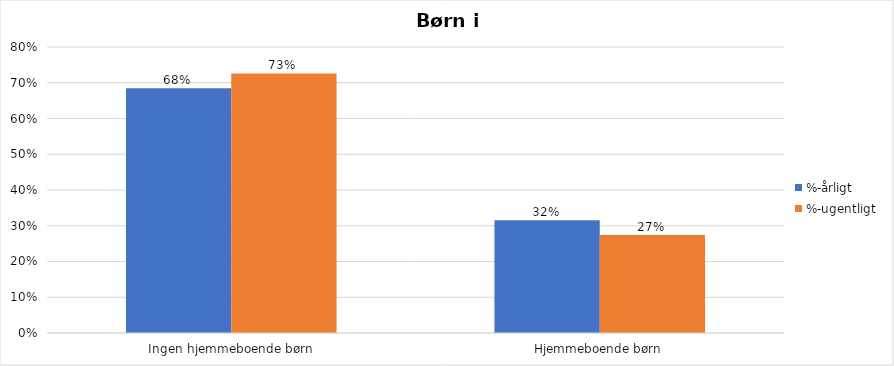
| Category | %-årligt | %-ugentligt |
|---|---|---|
| Ingen hjemmeboende børn | 0.685 | 0.726 |
| Hjemmeboende børn | 0.315 | 0.274 |